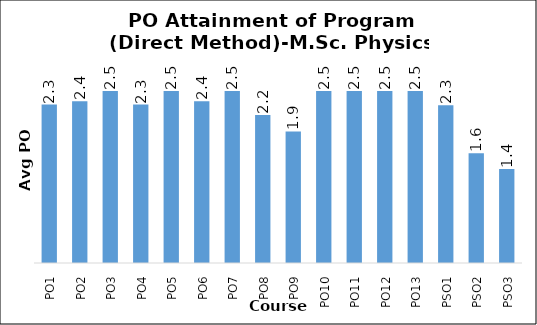
| Category | Avg. PO |
|---|---|
| PO1 | 2.341 |
| PO2 | 2.389 |
| PO3 | 2.542 |
| PO4 | 2.341 |
| PO5 | 2.542 |
| PO6 | 2.389 |
| PO7 | 2.542 |
| PO8 | 2.188 |
| PO9 | 1.945 |
| PO10 | 2.542 |
| PO11 | 2.542 |
| PO12 | 2.542 |
| PO13 | 2.542 |
| PSO1 | 2.331 |
| PSO2 | 1.624 |
| PSO3 | 1.389 |